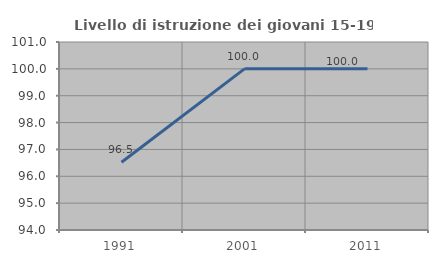
| Category | Livello di istruzione dei giovani 15-19 anni |
|---|---|
| 1991.0 | 96.522 |
| 2001.0 | 100 |
| 2011.0 | 100 |